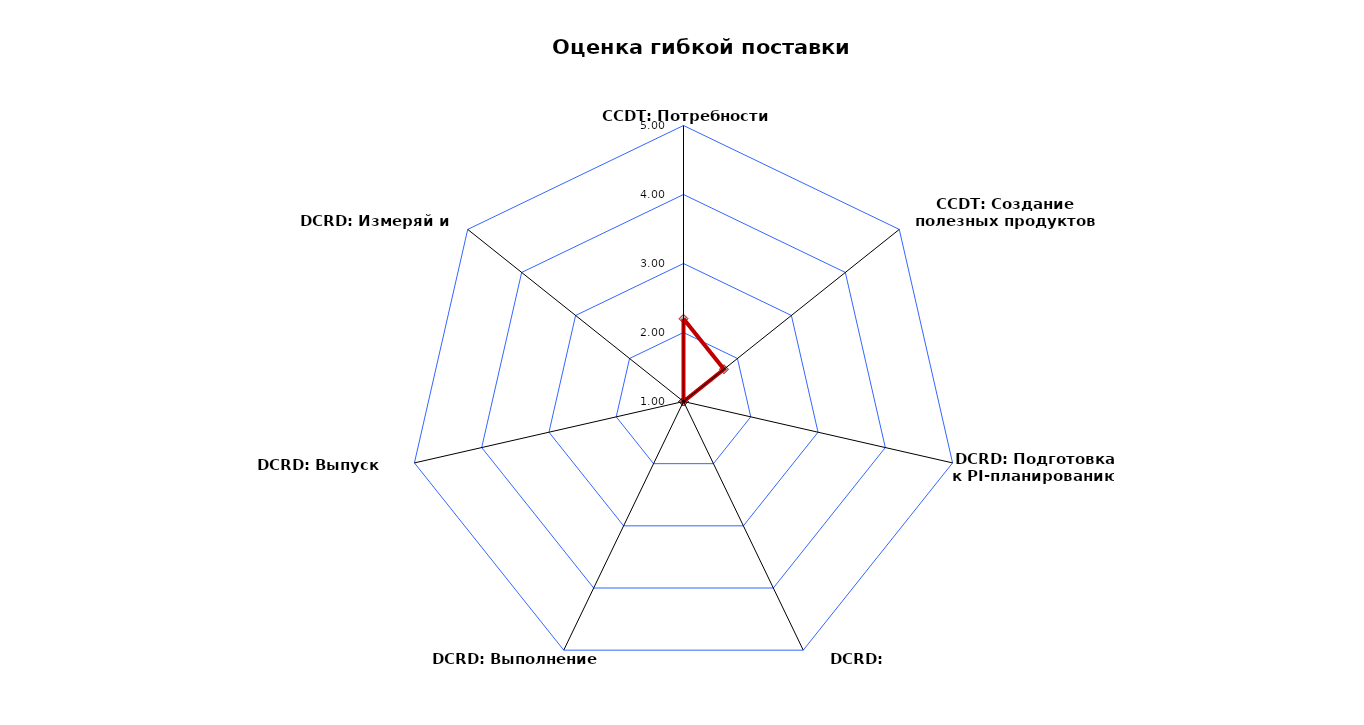
| Category | Series 0 |
|---|---|
| CCDT: Потребности клиентов | 2.2 |
| CCDT: Создание полезных продуктов | 1.75 |
| DCRD: Подготовка к PI-планированию | 1 |
| DCRD: PI-планирование | 1 |
| DCRD: Выполнение PI | 1 |
| DCRD: Выпуск ценности | 1 |
| DCRD: Измеряй и учись | 1 |